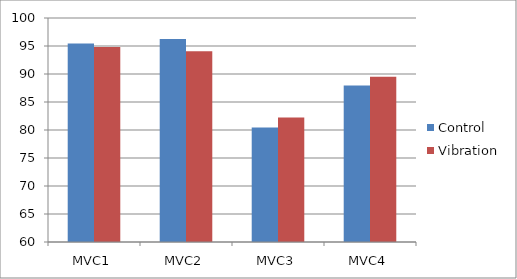
| Category | Control | Vibration |
|---|---|---|
| MVC1 | 95.457 | 94.809 |
| MVC2 | 96.238 | 94.081 |
| MVC3 | 80.425 | 82.234 |
| MVC4 | 87.936 | 89.504 |